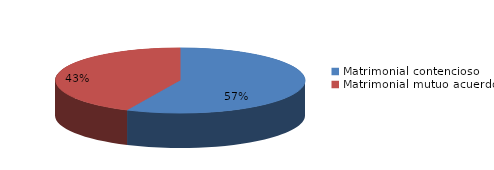
| Category | Series 0 |
|---|---|
| 0 | 74 |
| 1 | 56 |